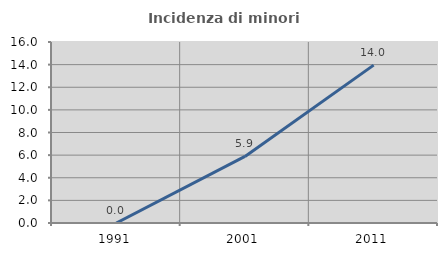
| Category | Incidenza di minori stranieri |
|---|---|
| 1991.0 | 0 |
| 2001.0 | 5.882 |
| 2011.0 | 13.953 |